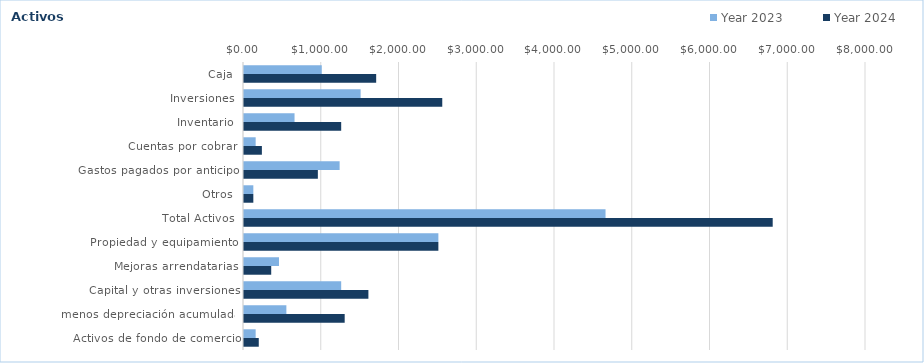
| Category | Year 2023 | Year 2024 |
|---|---|---|
| Caja | 1000 | 1700 |
| Inversiones | 1500 | 2550 |
| Inventario | 650 | 1250 |
| Cuentas por cobrar | 150 | 230 |
| Gastos pagados por anticipo | 1230 | 950 |
| Otros | 120 | 120 |
| Total Activos | 4650 | 6800 |
| Propiedad y equipamiento | 2500 | 2500 |
| Mejoras arrendatarias | 450 | 350 |
| Capital y otras inversiones | 1250 | 1600 |
| menos depreciación acumulada | 545 | 1295 |
| Activos de fondo de comercio | 150 | 190 |